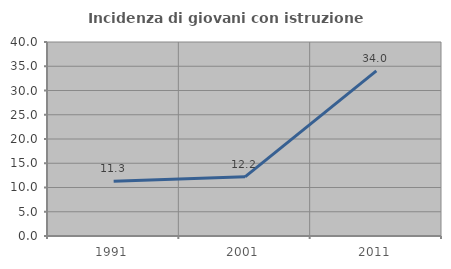
| Category | Incidenza di giovani con istruzione universitaria |
|---|---|
| 1991.0 | 11.29 |
| 2001.0 | 12.195 |
| 2011.0 | 34.043 |